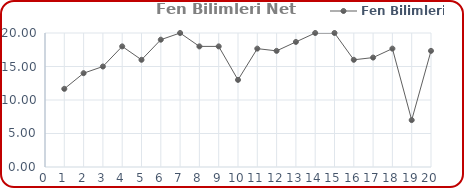
| Category | Fen Bilimleri |
|---|---|
| 0 | 11.667 |
| 1 | 14 |
| 2 | 15 |
| 3 | 18 |
| 4 | 16 |
| 5 | 19 |
| 6 | 20 |
| 7 | 18 |
| 8 | 18 |
| 9 | 13 |
| 10 | 17.667 |
| 11 | 17.333 |
| 12 | 18.667 |
| 13 | 20 |
| 14 | 20 |
| 15 | 16 |
| 16 | 16.333 |
| 17 | 17.667 |
| 18 | 7 |
| 19 | 17.333 |